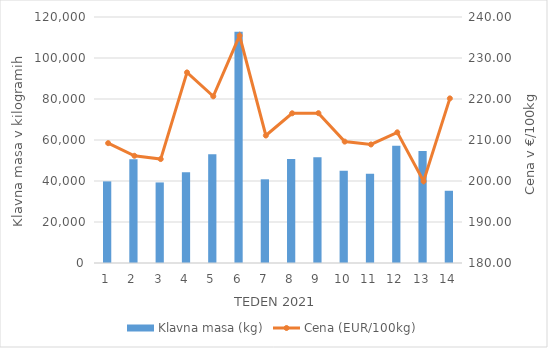
| Category | Klavna masa (kg) |
|---|---|
| 1.0 | 39814 |
| 2.0 | 50603 |
| 3.0 | 39295 |
| 4.0 | 44250 |
| 5.0 | 53061 |
| 6.0 | 112816 |
| 7.0 | 40829 |
| 8.0 | 50775 |
| 9.0 | 51535 |
| 10.0 | 45040 |
| 11.0 | 43536 |
| 12.0 | 57246 |
| 13.0 | 54680 |
| 14.0 | 35237 |